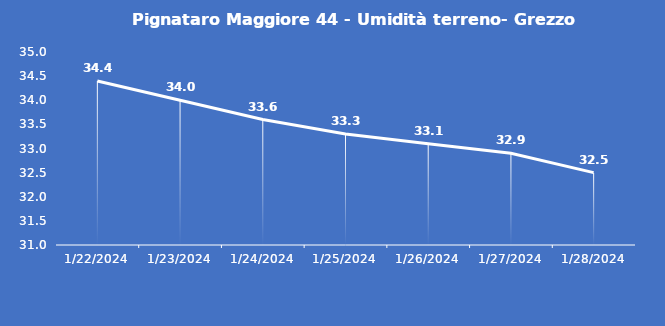
| Category | Pignataro Maggiore 44 - Umidità terreno- Grezzo (%VWC) |
|---|---|
| 1/22/24 | 34.4 |
| 1/23/24 | 34 |
| 1/24/24 | 33.6 |
| 1/25/24 | 33.3 |
| 1/26/24 | 33.1 |
| 1/27/24 | 32.9 |
| 1/28/24 | 32.5 |